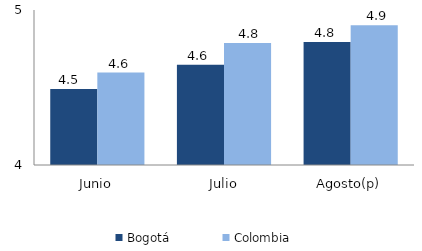
| Category | Bogotá | Colombia |
|---|---|---|
| Junio | 4.49 | 4.597 |
| Julio | 4.647 | 4.786 |
| Agosto(p) | 4.793 | 4.901 |